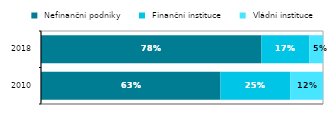
| Category |  Nefinanční podniky  |  Finanční instituce  |  Vládní instituce  |
|---|---|---|---|
| 2010.0 | 0.634 | 0.247 | 0.116 |
| 2018.0 | 0.778 | 0.169 | 0.048 |